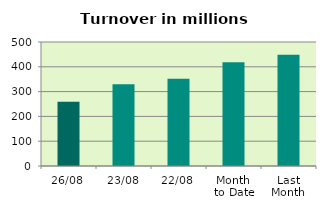
| Category | Series 0 |
|---|---|
| 26/08 | 259.14 |
| 23/08 | 329.962 |
| 22/08 | 351.357 |
| Month 
to Date | 418.004 |
| Last
Month | 448.907 |